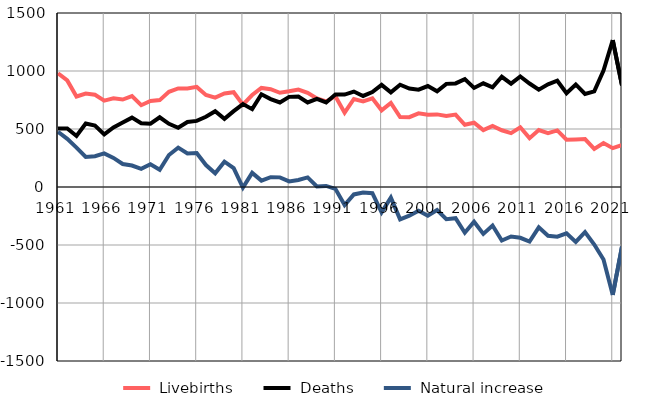
| Category |  Livebirths |  Deaths |  Natural increase |
|---|---|---|---|
| 1961.0 | 981 | 505 | 476 |
| 1962.0 | 919 | 504 | 415 |
| 1963.0 | 780 | 440 | 340 |
| 1964.0 | 806 | 547 | 259 |
| 1965.0 | 795 | 530 | 265 |
| 1966.0 | 744 | 454 | 290 |
| 1967.0 | 764 | 513 | 251 |
| 1968.0 | 754 | 556 | 198 |
| 1969.0 | 783 | 598 | 185 |
| 1970.0 | 705 | 549 | 156 |
| 1971.0 | 742 | 546 | 196 |
| 1972.0 | 749 | 601 | 148 |
| 1973.0 | 821 | 545 | 276 |
| 1974.0 | 850 | 511 | 339 |
| 1975.0 | 849 | 560 | 289 |
| 1976.0 | 863 | 570 | 293 |
| 1977.0 | 794 | 605 | 189 |
| 1978.0 | 771 | 653 | 118 |
| 1979.0 | 806 | 588 | 218 |
| 1980.0 | 817 | 654 | 163 |
| 1981.0 | 710 | 715 | -5 |
| 1982.0 | 793 | 671 | 122 |
| 1983.0 | 854 | 799 | 55 |
| 1984.0 | 843 | 758 | 85 |
| 1985.0 | 812 | 729 | 83 |
| 1986.0 | 825 | 777 | 48 |
| 1987.0 | 840 | 779 | 61 |
| 1988.0 | 812 | 729 | 83 |
| 1989.0 | 764 | 759 | 5 |
| 1990.0 | 738 | 729 | 9 |
| 1991.0 | 782 | 798 | -16 |
| 1992.0 | 641 | 797 | -156 |
| 1993.0 | 759 | 823 | -64 |
| 1994.0 | 738 | 785 | -47 |
| 1995.0 | 765 | 818 | -53 |
| 1996.0 | 661 | 880 | -219 |
| 1997.0 | 724 | 816 | -92 |
| 1998.0 | 603 | 882 | -279 |
| 1999.0 | 602 | 849 | -247 |
| 2000.0 | 635 | 839 | -204 |
| 2001.0 | 623 | 870 | -247 |
| 2002.0 | 626 | 825 | -199 |
| 2003.0 | 612 | 889 | -277 |
| 2004.0 | 624 | 893 | -269 |
| 2005.0 | 536 | 930 | -394 |
| 2006.0 | 554 | 854 | -300 |
| 2007.0 | 490 | 894 | -404 |
| 2008.0 | 527 | 859 | -332 |
| 2009.0 | 489 | 950 | -461 |
| 2010.0 | 464 | 891 | -427 |
| 2011.0 | 515 | 953 | -438 |
| 2012.0 | 421 | 892 | -471 |
| 2013.0 | 491 | 839 | -348 |
| 2014.0 | 464 | 885 | -421 |
| 2015.0 | 488 | 916 | -428 |
| 2016.0 | 408 | 808 | -400 |
| 2017.0 | 410 | 884 | -474 |
| 2018.0 | 413 | 802 | -389 |
| 2019.0 | 328 | 824 | -496 |
| 2020.0 | 379 | 1004 | -625 |
| 2021.0 | 335 | 1266 | -931 |
| 2022.0 | 362 | 877 | -515 |